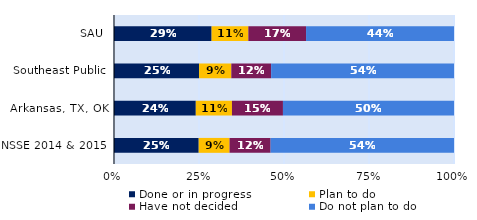
| Category | Done or in progress | Plan to do | Have not decided | Do not plan to do |
|---|---|---|---|---|
| SAU | 0.287 | 0.108 | 0.17 | 0.435 |
| Southeast Public | 0.25 | 0.095 | 0.117 | 0.538 |
| Arkansas, TX, OK | 0.241 | 0.106 | 0.15 | 0.503 |
| NSSE 2014 & 2015 | 0.249 | 0.091 | 0.121 | 0.539 |